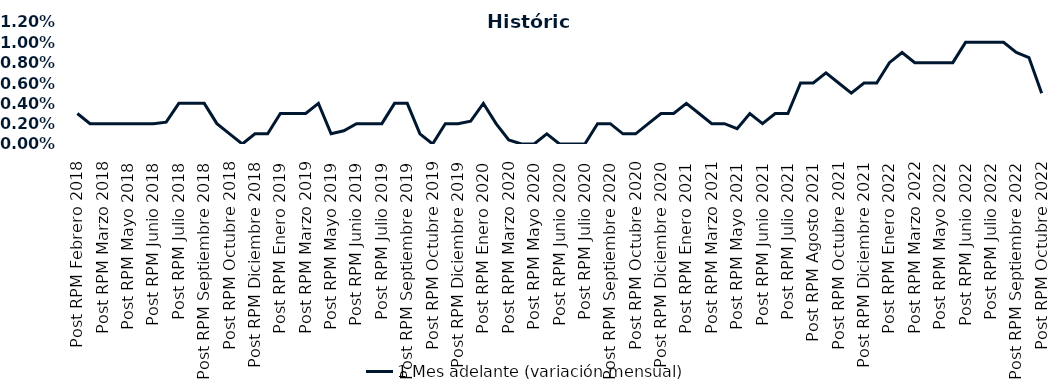
| Category | 1 Mes adelante (variación mensual) |
|---|---|
| Post RPM Febrero 2018 | 0.003 |
| Pre RPM Marzo 2018 | 0.002 |
| Post RPM Marzo 2018 | 0.002 |
| Pre RPM Mayo 2018 | 0.002 |
| Post RPM Mayo 2018 | 0.002 |
| Pre RPM Junio 2018 | 0.002 |
| Post RPM Junio 2018 | 0.002 |
| Pre RPM Julio 2018 | 0.002 |
| Post RPM Julio 2018 | 0.004 |
| Pre RPM Septiembre 2018 | 0.004 |
| Post RPM Septiembre 2018 | 0.004 |
| Pre RPM Octubre 2018 | 0.002 |
| Post RPM Octubre 2018 | 0.001 |
| Pre RPM Diciembre 2018 | 0 |
| Post RPM Diciembre 2018 | 0.001 |
| Pre RPM Enero 2019 | 0.001 |
| Post RPM Enero 2019 | 0.003 |
| Pre RPM Marzo 2019 | 0.003 |
| Post RPM Marzo 2019 | 0.003 |
| Pre RPM Mayo 2019 | 0.004 |
| Post RPM Mayo 2019 | 0.001 |
| Pre RPM Junio 2019 | 0.001 |
| Post RPM Junio 2019 | 0.002 |
| Pre RPM Julio 2019 | 0.002 |
| Post RPM Julio 2019 | 0.002 |
| Pre RPM Septiembre 2019 | 0.004 |
| Post RPM Septiembre 2019 | 0.004 |
| Pre RPM Octubre 2019 | 0.001 |
| Post RPM Octubre 2019 | 0 |
| Pre RPM Diciembre 2019 | 0.002 |
| Post RPM Diciembre 2019 | 0.002 |
| Pre RPM Enero 2020 | 0.002 |
| Post RPM Enero 2020 | 0.004 |
| Pre RPM Marzo 2020 | 0.002 |
| Post RPM Marzo 2020 | 0 |
| Pre RPM Mayo 2020 | 0 |
| Post RPM Mayo 2020 | 0 |
| Pre RPM Junio 2020 | 0.001 |
| Post RPM Junio 2020 | 0 |
| Pre RPM Julio 2020 | 0 |
| Post RPM Julio 2020 | 0 |
| Pre RPM Septiembre 2020 | 0.002 |
| Post RPM Septiembre 2020 | 0.002 |
| Pre RPM Octubre 2020 | 0.001 |
| Post RPM Octubre 2020 | 0.001 |
| Pre RPM Diciembre 2020 | 0.002 |
| Post RPM Diciembre 2020 | 0.003 |
| Pre RPM Enero 2021 | 0.003 |
| Post RPM Enero 2021 | 0.004 |
| Pre RPM Marzo 2021 | 0.003 |
| Post RPM Marzo 2021 | 0.002 |
| Pre RPM Mayo 2021 | 0.002 |
| Post RPM Mayo 2021 | 0.002 |
| Pre RPM Junio 2021 | 0.003 |
| Post RPM Junio 2021 | 0.002 |
| Pre RPM Julio 2021 | 0.003 |
| Post RPM Julio 2021 | 0.003 |
| Pre RPM Agosto 2021 | 0.006 |
| Post RPM Agosto 2021 | 0.006 |
| Pre RPM Octubre 2021 | 0.007 |
| Post RPM Octubre 2021 | 0.006 |
| Pre RPM Diciembre 2021 | 0.005 |
| Post RPM Diciembre 2021 | 0.006 |
| Pre RPM Enero 2022 | 0.006 |
| Post RPM Enero 2022 | 0.008 |
| Pre RPM Marzo 2022 | 0.009 |
| Post RPM Marzo 2022 | 0.008 |
| Pre RPM Mayo 2022 | 0.008 |
| Post RPM Mayo 2022 | 0.008 |
| Pre RPM Junio 2022 | 0.008 |
| Post RPM Junio 2022 | 0.01 |
| Pre RPM Julio 2022 | 0.01 |
| Post RPM Julio 2022 | 0.01 |
| Pre RPM Septiembre 2022 | 0.01 |
| Post RPM Septiembre 2022 | 0.009 |
| Pre RPM Octubre 2022 | 0.008 |
| Post RPM Octubre 2022 | 0.005 |